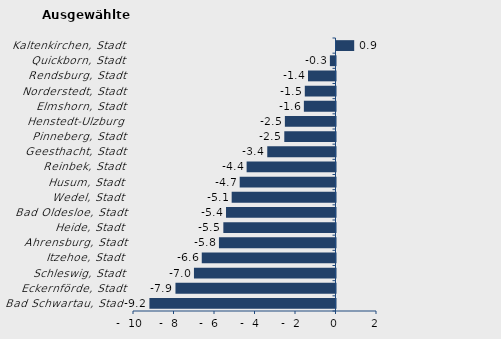
| Category | Überschuss der Geborenen (+) bzw. Gestorbenen (-) |
|---|---|
| Bad Schwartau, Stadt | -9.19 |
| Eckernförde, Stadt | -7.903 |
| Schleswig, Stadt | -6.99 |
| Itzehoe, Stadt | -6.605 |
| Ahrensburg, Stadt | -5.756 |
| Heide, Stadt | -5.539 |
| Bad Oldesloe, Stadt | -5.407 |
| Wedel, Stadt | -5.127 |
| Husum, Stadt | -4.731 |
| Reinbek, Stadt | -4.389 |
| Geesthacht, Stadt | -3.37 |
| Pinneberg, Stadt | -2.529 |
| Henstedt-Ulzburg | -2.5 |
| Elmshorn, Stadt | -1.562 |
| Norderstedt, Stadt | -1.516 |
| Rendsburg, Stadt | -1.359 |
| Quickborn, Stadt | -0.277 |
| Kaltenkirchen, Stadt | 0.874 |